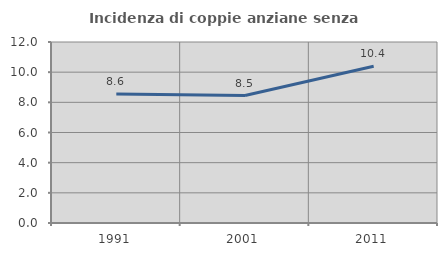
| Category | Incidenza di coppie anziane senza figli  |
|---|---|
| 1991.0 | 8.55 |
| 2001.0 | 8.451 |
| 2011.0 | 10.39 |